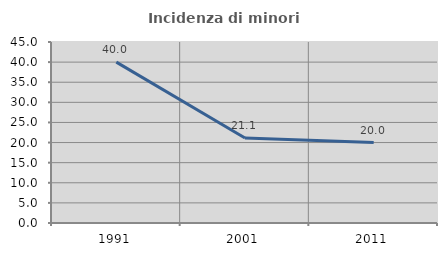
| Category | Incidenza di minori stranieri |
|---|---|
| 1991.0 | 40 |
| 2001.0 | 21.127 |
| 2011.0 | 20 |